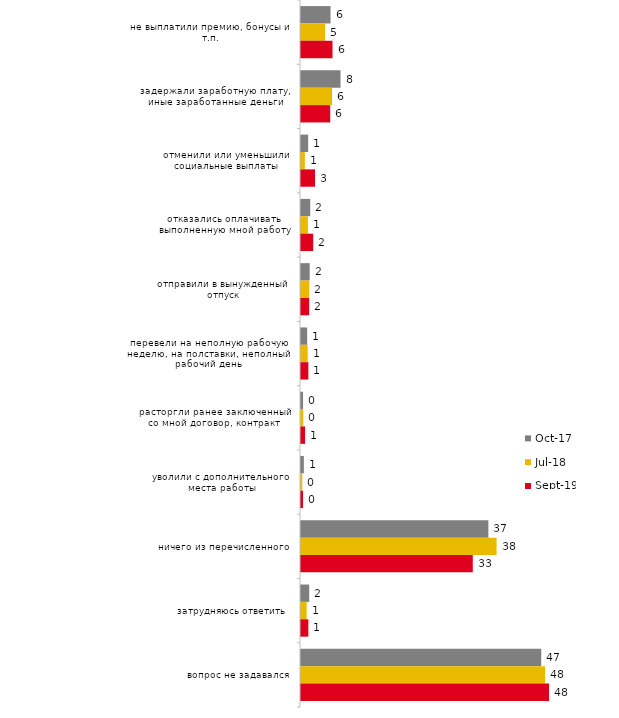
| Category | окт.17 | июл.18 | сен.19 |
|---|---|---|---|
| не выплатили премию, бонусы и т.п. | 5.75 | 4.7 | 6.139 |
| задержали заработную плату, иные заработанные деньги | 7.7 | 6.05 | 5.693 |
| отменили или уменьшили социальные выплаты | 1.4 | 0.75 | 2.723 |
| отказались оплачивать выполненную мной работу | 1.8 | 1.35 | 2.376 |
| отправили в вынужденный отпуск | 1.7 | 1.6 | 1.584 |
| перевели на неполную рабочую неделю, на полставки, неполный рабочий день | 1.2 | 1.3 | 1.436 |
| расторгли ранее заключенный со мной договор, контракт | 0.4 | 0.45 | 0.792 |
| уволили с дополнительного места работы | 0.55 | 0.25 | 0.396 |
| ничего из перечисленного | 36.5 | 38.1 | 33.465 |
| затрудняюсь ответить | 1.6 | 1.1 | 1.436 |
| вопрос не задавался | 46.8 | 47.55 | 48.317 |